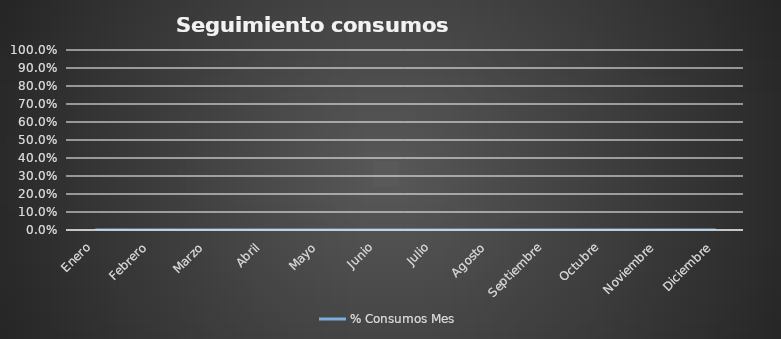
| Category | % Consumos Mes |
|---|---|
| Enero | 0 |
| Febrero | 0 |
| Marzo | 0 |
| Abril | 0 |
| Mayo | 0 |
| Junio | 0 |
| Julio | 0 |
| Agosto | 0 |
| Septiembre | 0 |
| Octubre | 0 |
| Noviembre | 0 |
| Diciembre | 0 |